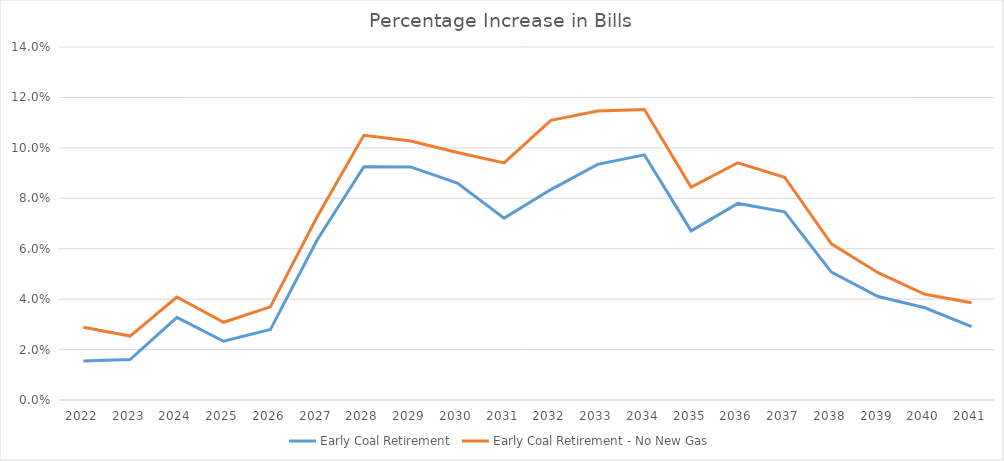
| Category | Early Coal Retirement | Early Coal Retirement - No New Gas |
|---|---|---|
| 2022.0 | 0.015 | 0.029 |
| 2023.0 | 0.016 | 0.025 |
| 2024.0 | 0.033 | 0.041 |
| 2025.0 | 0.023 | 0.031 |
| 2026.0 | 0.028 | 0.037 |
| 2027.0 | 0.063 | 0.073 |
| 2028.0 | 0.092 | 0.105 |
| 2029.0 | 0.092 | 0.103 |
| 2030.0 | 0.086 | 0.098 |
| 2031.0 | 0.072 | 0.094 |
| 2032.0 | 0.083 | 0.111 |
| 2033.0 | 0.093 | 0.115 |
| 2034.0 | 0.097 | 0.115 |
| 2035.0 | 0.067 | 0.084 |
| 2036.0 | 0.078 | 0.094 |
| 2037.0 | 0.075 | 0.088 |
| 2038.0 | 0.051 | 0.062 |
| 2039.0 | 0.041 | 0.051 |
| 2040.0 | 0.037 | 0.042 |
| 2041.0 | 0.029 | 0.039 |